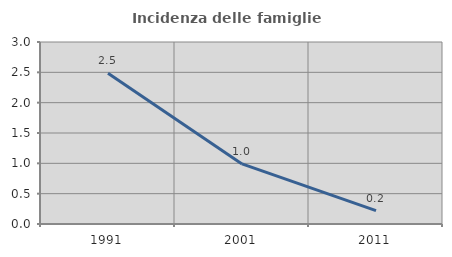
| Category | Incidenza delle famiglie numerose |
|---|---|
| 1991.0 | 2.486 |
| 2001.0 | 0.99 |
| 2011.0 | 0.222 |